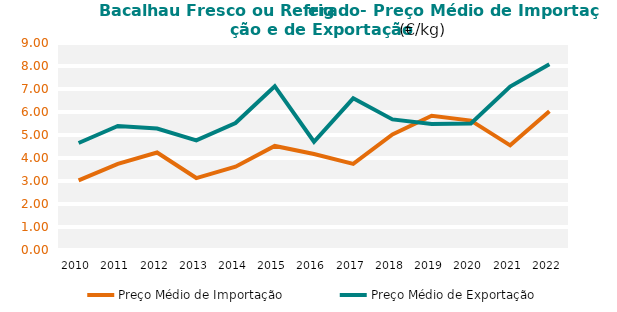
| Category | Preço Médio de Importação | Preço Médio de Exportação |
|---|---|---|
| 2010.0 | 3.03 | 4.654 |
| 2011.0 | 3.743 | 5.394 |
| 2012.0 | 4.24 | 5.281 |
| 2013.0 | 3.128 | 4.764 |
| 2014.0 | 3.623 | 5.523 |
| 2015.0 | 4.523 | 7.122 |
| 2016.0 | 4.173 | 4.708 |
| 2017.0 | 3.745 | 6.595 |
| 2018.0 | 5.027 | 5.678 |
| 2019.0 | 5.837 | 5.475 |
| 2020.0 | 5.626 | 5.498 |
| 2021.0 | 4.55 | 7.106 |
| 2022.0 | 6.037 | 8.075 |